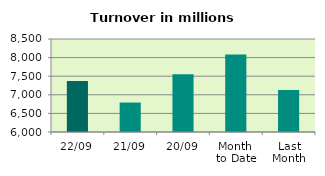
| Category | Series 0 |
|---|---|
| 22/09 | 7371.594 |
| 21/09 | 6791.81 |
| 20/09 | 7552.47 |
| Month 
to Date | 8080.638 |
| Last
Month | 7128.729 |